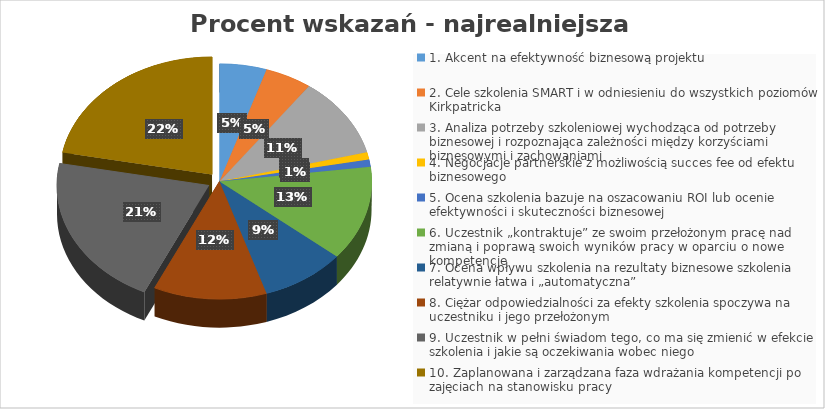
| Category | Series 0 |
|---|---|
| 1. Akcent na efektywność biznesową projektu | 5 |
| 2. Cele szkolenia SMART i w odniesieniu do wszystkich poziomów Kirkpatricka | 5 |
| 3. Analiza potrzeby szkoleniowej wychodząca od potrzeby biznesowej i rozpoznająca zależności między korzyściami biznesowymi i zachowaniami | 11 |
| 4. Negocjacje partnerskie z możliwością succes fee od efektu biznesowego  | 1 |
| 5. Ocena szkolenia bazuje na oszacowaniu ROI lub ocenie efektywności i skuteczności biznesowej | 1 |
| 6. Uczestnik „kontraktuje” ze swoim przełożonym pracę nad zmianą i poprawą swoich wyników pracy w oparciu o nowe kompetencje | 13 |
| 7. Ocena wpływu szkolenia na rezultaty biznesowe szkolenia relatywnie łatwa i „automatyczna” | 9 |
| 8. Ciężar odpowiedzialności za efekty szkolenia spoczywa na uczestniku i jego przełożonym | 12 |
| 9. Uczestnik w pełni świadom tego, co ma się zmienić w efekcie szkolenia i jakie są oczekiwania wobec niego | 21 |
| 10. Zaplanowana i zarządzana faza wdrażania kompetencji po zajęciach na stanowisku pracy | 22 |